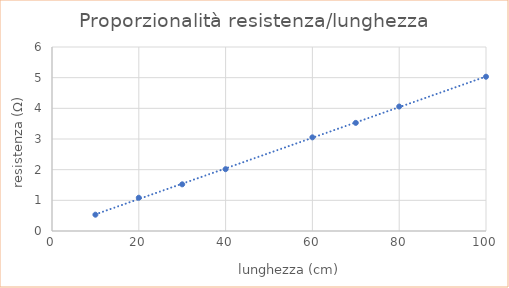
| Category | Series 0 |
|---|---|
| 10.0 | 0.532 |
| 20.0 | 1.084 |
| 30.0 | 1.522 |
| 40.0 | 2.016 |
| 60.0 | 3.054 |
| 70.0 | 3.526 |
| 80.0 | 4.059 |
| 100.0 | 5.031 |